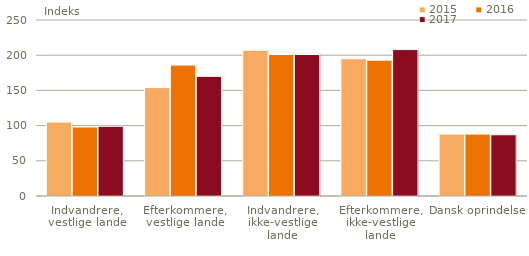
| Category | 2015 | 2016 | 2017 |
|---|---|---|---|
| Indvandrere,
vestlige lande | 105 | 98 | 99 |
| Efterkommere,
vestlige lande | 154 | 186 | 170 |
| Indvandrere,
ikke-vestlige lande | 207 | 201 | 201 |
| Efterkommere,
ikke-vestlige lande | 195 | 193 | 208 |
| Dansk oprindelse | 88 | 88 | 87 |